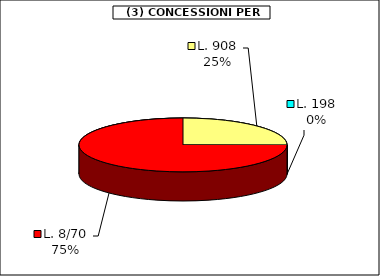
| Category | Series 0 |
|---|---|
| L. 908 | 13260 |
| L. 198 | 0 |
| L. 8/70 | 39556.75 |